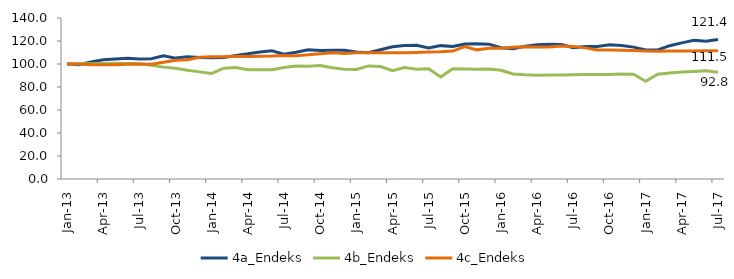
| Category | 4a_Endeks | 4b_Endeks | 4c_Endeks |
|---|---|---|---|
| 2013-01-01 | 100 | 100 | 100 |
| 2013-02-01 | 99.341 | 100.186 | 100.103 |
| 2013-03-01 | 101.699 | 100.316 | 99.376 |
| 2013-04-01 | 103.715 | 100.44 | 99.308 |
| 2013-05-01 | 104.428 | 100.593 | 99.354 |
| 2013-06-01 | 104.927 | 100.359 | 99.825 |
| 2013-07-01 | 104.291 | 100.235 | 100.034 |
| 2013-08-01 | 104.606 | 98.919 | 99.816 |
| 2013-09-01 | 107.058 | 97.279 | 101.465 |
| 2013-10-01 | 105.121 | 96.391 | 103.332 |
| 2013-11-01 | 106.291 | 94.505 | 103.676 |
| 2013-12-01 | 105.691 | 93.157 | 105.779 |
| 2014-01-01 | 105.394 | 91.809 | 106.405 |
| 2014-02-01 | 105.621 | 96.342 | 106.324 |
| 2014-03-01 | 107.422 | 96.881 | 106.808 |
| 2014-04-01 | 108.822 | 94.985 | 106.63 |
| 2014-05-01 | 110.468 | 94.991 | 106.797 |
| 2014-06-01 | 111.423 | 95.048 | 106.9 |
| 2014-07-01 | 108.578 | 97.037 | 107.377 |
| 2014-08-01 | 110.144 | 98.176 | 107.181 |
| 2014-09-01 | 112.457 | 98.105 | 107.944 |
| 2014-10-01 | 111.75 | 98.688 | 109.01 |
| 2014-11-01 | 111.99 | 96.8 | 109.792 |
| 2014-12-01 | 111.927 | 95.408 | 109.034 |
| 2015-01-01 | 110.39 | 95.212 | 109.696 |
| 2015-02-01 | 109.858 | 98.341 | 109.798 |
| 2015-03-01 | 112.398 | 97.783 | 109.691 |
| 2015-04-01 | 114.992 | 94.11 | 109.772 |
| 2015-05-01 | 116.136 | 97.001 | 109.771 |
| 2015-06-01 | 116.229 | 95.486 | 110.077 |
| 2015-07-01 | 113.85 | 95.779 | 110.496 |
| 2015-08-01 | 115.972 | 88.733 | 110.564 |
| 2015-09-01 | 115.313 | 95.871 | 111.229 |
| 2015-10-01 | 117.465 | 95.632 | 115.106 |
| 2015-11-01 | 117.589 | 95.515 | 112.299 |
| 2015-12-01 | 117.231 | 95.591 | 113.643 |
| 2016-01-01 | 114.144 | 94.602 | 113.723 |
| 2016-02-01 | 113.342 | 91.378 | 114.666 |
| 2016-03-01 | 115.432 | 90.561 | 115.02 |
| 2016-04-01 | 116.822 | 90.152 | 114.769 |
| 2016-05-01 | 117.084 | 90.532 | 114.842 |
| 2016-06-01 | 117 | 90.422 | 115.564 |
| 2016-07-01 | 114.224 | 90.567 | 115.133 |
| 2016-08-01 | 115.159 | 90.767 | 114.028 |
| 2016-09-01 | 115.153 | 90.854 | 112.174 |
| 2016-10-01 | 116.776 | 90.934 | 112.226 |
| 2016-11-01 | 116.121 | 91.325 | 111.9 |
| 2016-12-01 | 114.684 | 91.154 | 111.757 |
| 2017-01-01 | 112.121 | 85.031 | 111.361 |
| 2017-02-01 | 112.207 | 91.066 | 111.141 |
| 2017-03-01 | 115.907 | 92.252 | 111.35 |
| 2017-04-01 | 118.39 | 93.129 | 111.317 |
| 2017-05-01 | 120.58 | 93.519 | 111.341 |
| 2017-06-01 | 119.763 | 94.111 | 111.573 |
| 2017-07-01 | 121.35 | 92.836 | 111.511 |